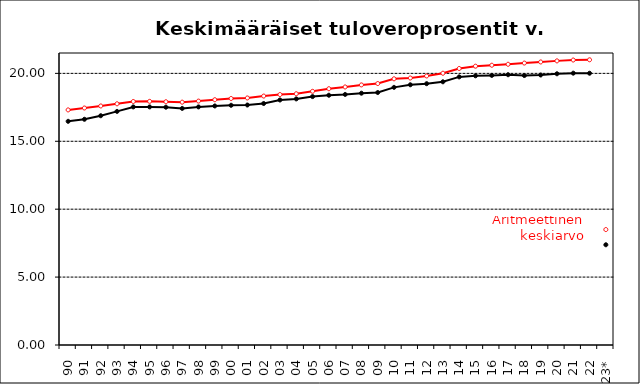
| Category | Series 2 | Series 3 |
|---|---|---|
| 90 | 16.47 | 17.31 |
| 91 | 16.62 | 17.45 |
| 92 | 16.88 | 17.6 |
| 93 | 17.2 | 17.76 |
| 94 | 17.53 | 17.93 |
| 95 | 17.53 | 17.94 |
| 96 | 17.51 | 17.91 |
| 97 | 17.42 | 17.88 |
| 98 | 17.53 | 17.96 |
| 99 | 17.6 | 18.06 |
| 00 | 17.65 | 18.15 |
| 01 | 17.67 | 18.19 |
| 02 | 17.78 | 18.33 |
| 03 | 18.04 | 18.44 |
| 04 | 18.12 | 18.5 |
| 05 | 18.29 | 18.68 |
| 06 | 18.39 | 18.87 |
| 07 | 18.45 | 19 |
| 08 | 18.54 | 19.15 |
| 09 | 18.59 | 19.25 |
| 10 | 18.97 | 19.6 |
| 11 | 19.16 | 19.66 |
| 12 | 19.24 | 19.81 |
| 13 | 19.38 | 20.01 |
| 14 | 19.74 | 20.36 |
| 15 | 19.82 | 20.53 |
| 16 | 19.85 | 20.6 |
| 17 | 19.9 | 20.67 |
| 18 | 19.84 | 20.76 |
| 19 | 19.88 | 20.84 |
| 20 | 19.97 | 20.92 |
| 21 | 20.016 | 20.983 |
| 22 | 20.01 | 21 |
| 23* | 7.38 | 8.5 |